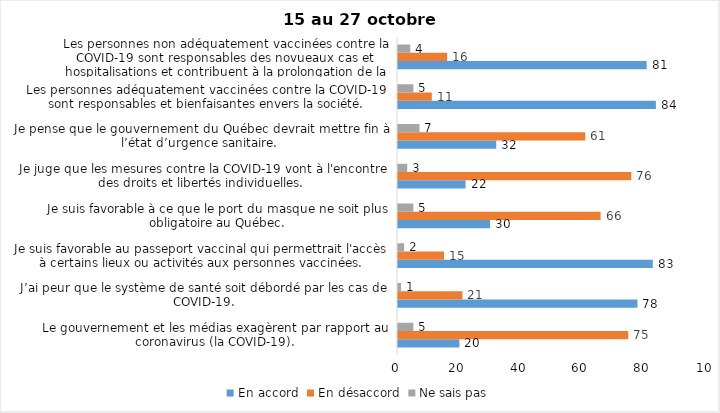
| Category | En accord | En désaccord | Ne sais pas |
|---|---|---|---|
| Le gouvernement et les médias exagèrent par rapport au coronavirus (la COVID-19). | 20 | 75 | 5 |
| J’ai peur que le système de santé soit débordé par les cas de COVID-19. | 78 | 21 | 1 |
| Je suis favorable au passeport vaccinal qui permettrait l'accès à certains lieux ou activités aux personnes vaccinées. | 83 | 15 | 2 |
| Je suis favorable à ce que le port du masque ne soit plus obligatoire au Québec. | 30 | 66 | 5 |
| Je juge que les mesures contre la COVID-19 vont à l'encontre des droits et libertés individuelles.  | 22 | 76 | 3 |
| Je pense que le gouvernement du Québec devrait mettre fin à l’état d’urgence sanitaire.  | 32 | 61 | 7 |
| Les personnes adéquatement vaccinées contre la COVID-19 sont responsables et bienfaisantes envers la société. | 84 | 11 | 5 |
| Les personnes non adéquatement vaccinées contre la COVID-19 sont responsables des novueaux cas et hospitalisations et contribuent à la prolongation de la pandémie au Québec. | 81 | 16 | 4 |